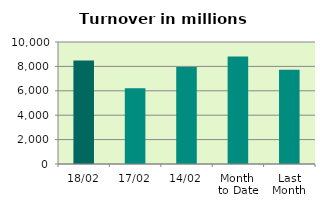
| Category | Series 0 |
|---|---|
| 18/02 | 8485.638 |
| 17/02 | 6209.499 |
| 14/02 | 7946.4 |
| Month 
to Date | 8810.724 |
| Last
Month | 7723.751 |